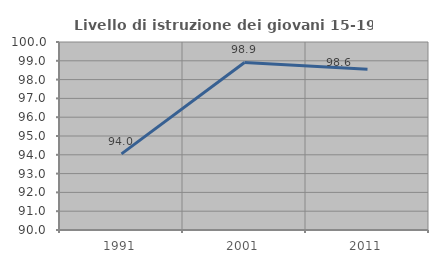
| Category | Livello di istruzione dei giovani 15-19 anni |
|---|---|
| 1991.0 | 94.048 |
| 2001.0 | 98.913 |
| 2011.0 | 98.551 |